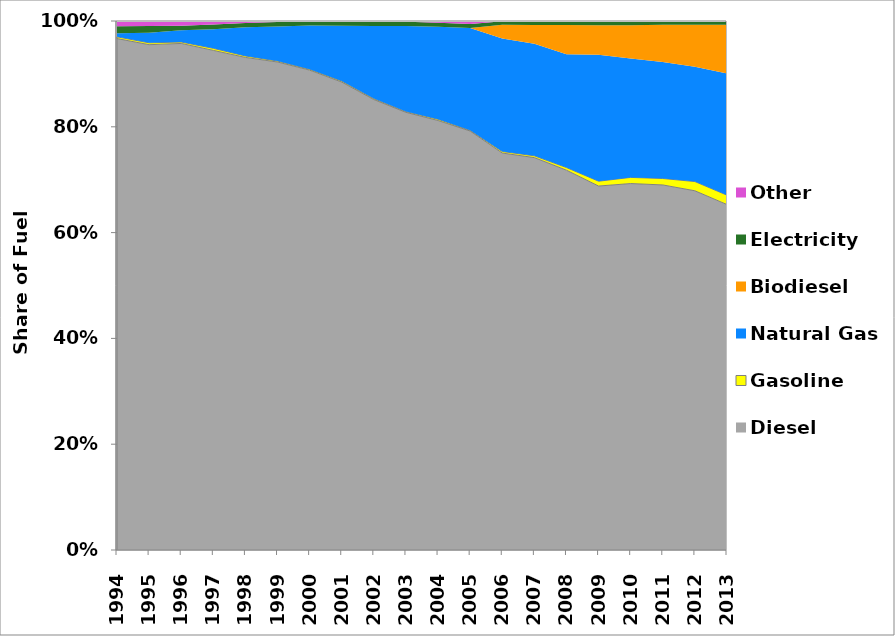
| Category | Diesel | Gasoline | Natural Gas | Biodiesel | Electricity | Other |
|---|---|---|---|---|---|---|
| 1994.0 | 0.967 | 0.003 | 0.007 | 0 | 0.013 | 0.01 |
| 1995.0 | 0.955 | 0.004 | 0.019 | 0 | 0.013 | 0.009 |
| 1996.0 | 0.958 | 0.003 | 0.022 | 0 | 0.009 | 0.009 |
| 1997.0 | 0.944 | 0.004 | 0.036 | 0 | 0.009 | 0.006 |
| 1998.0 | 0.931 | 0.003 | 0.054 | 0 | 0.008 | 0.004 |
| 1999.0 | 0.922 | 0.002 | 0.065 | 0 | 0.008 | 0.002 |
| 2000.0 | 0.907 | 0.002 | 0.083 | 0 | 0.008 | 0.001 |
| 2001.0 | 0.885 | 0.002 | 0.105 | 0 | 0.008 | 0.001 |
| 2002.0 | 0.851 | 0.002 | 0.137 | 0 | 0.008 | 0.001 |
| 2003.0 | 0.827 | 0.002 | 0.162 | 0 | 0.008 | 0.001 |
| 2004.0 | 0.812 | 0.002 | 0.175 | 0 | 0.007 | 0.003 |
| 2005.0 | 0.792 | 0.001 | 0.194 | 0 | 0.007 | 0.006 |
| 2006.0 | 0.75 | 0.003 | 0.214 | 0.026 | 0.006 | 0.001 |
| 2007.0 | 0.742 | 0.003 | 0.212 | 0.035 | 0.007 | 0.001 |
| 2008.0 | 0.718 | 0.005 | 0.214 | 0.055 | 0.007 | 0.001 |
| 2009.0 | 0.688 | 0.009 | 0.239 | 0.056 | 0.008 | 0 |
| 2010.0 | 0.693 | 0.012 | 0.225 | 0.063 | 0.008 | 0 |
| 2011.0 | 0.69 | 0.012 | 0.22 | 0.071 | 0.007 | 0 |
| 2012.0 | 0.679 | 0.017 | 0.217 | 0.08 | 0.007 | 0 |
| 2013.0 | 0.653 | 0.018 | 0.23 | 0.092 | 0.007 | 0 |